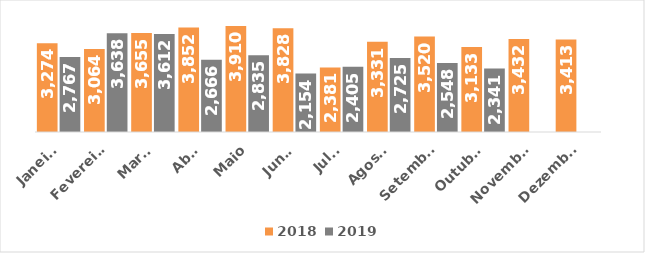
| Category | 2018 | 2019 |
|---|---|---|
| Janeiro | 3274 | 2767 |
| Fevereiro | 3064 | 3638 |
| Março | 3655 | 3612 |
| Abril | 3852 | 2666 |
| Maio | 3910 | 2835 |
| Junho | 3828 | 2154 |
| Julho | 2381 | 2405 |
| Agosto | 3331 | 2725 |
| Setembro | 3520 | 2548 |
| Outubro | 3133 | 2341 |
| Novembro | 3432 | 0 |
| Dezembro | 3413 | 0 |